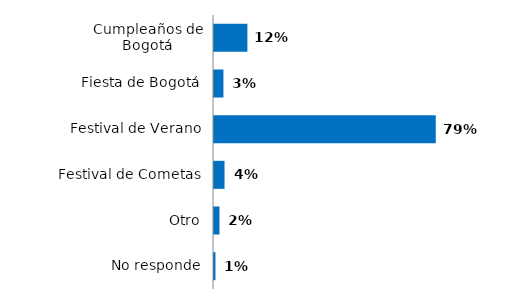
| Category | Series 0 |
|---|---|
| Cumpleaños de Bogotá | 0.118 |
| Fiesta de Bogotá | 0.033 |
| Festival de Verano | 0.786 |
| Festival de Cometas | 0.037 |
| Otro | 0.019 |
| No responde | 0.005 |